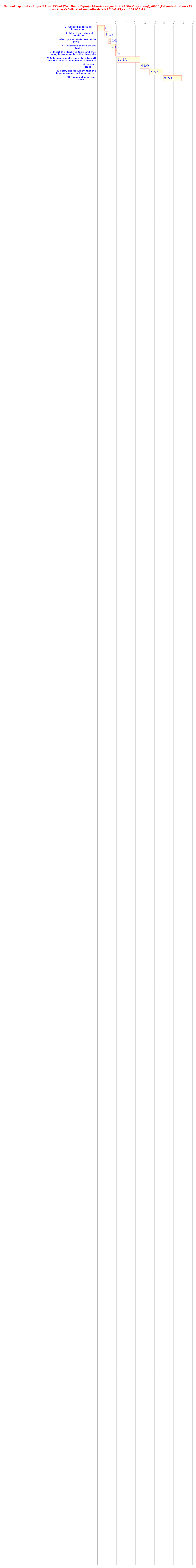
| Category | Start | Work-days |
|---|---|---|
| 1) Gather background information | 0 | 3.7 |
| 2) Identify a technical resolution | 3.7 | 1.9 |
| 3) Identify what tasks need to be done | 5.6 | 1.3 |
| 4) Determine how to do the tasks | 6.9 | 2.5 |
| 5) Insert the identified tasks and their timing information into this time-table | 9.4 | 0.7 |
| 6) Determine and document how to verify that the tasks accomplish what needs to be done | 10.1 | 12.2 |
| 7) Do the tasks | 22.3 | 4.9 |
| 8) Verify and document that the tasks accomplished what needed to be done | 27.2 | 7.3 |
| 9) Document what was done | 34.5 | 9.7 |